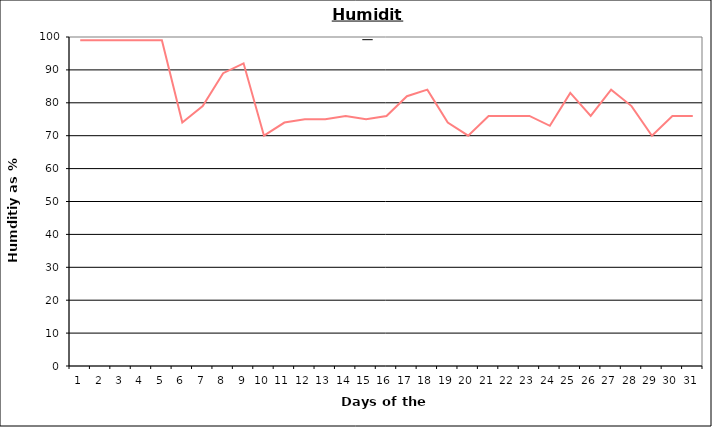
| Category | Series 0 |
|---|---|
| 0 | 99 |
| 1 | 99 |
| 2 | 99 |
| 3 | 99 |
| 4 | 99 |
| 5 | 74 |
| 6 | 79 |
| 7 | 89 |
| 8 | 92 |
| 9 | 70 |
| 10 | 74 |
| 11 | 75 |
| 12 | 75 |
| 13 | 76 |
| 14 | 75 |
| 15 | 76 |
| 16 | 82 |
| 17 | 84 |
| 18 | 74 |
| 19 | 70 |
| 20 | 76 |
| 21 | 76 |
| 22 | 76 |
| 23 | 73 |
| 24 | 83 |
| 25 | 76 |
| 26 | 84 |
| 27 | 79 |
| 28 | 70 |
| 29 | 76 |
| 30 | 76 |